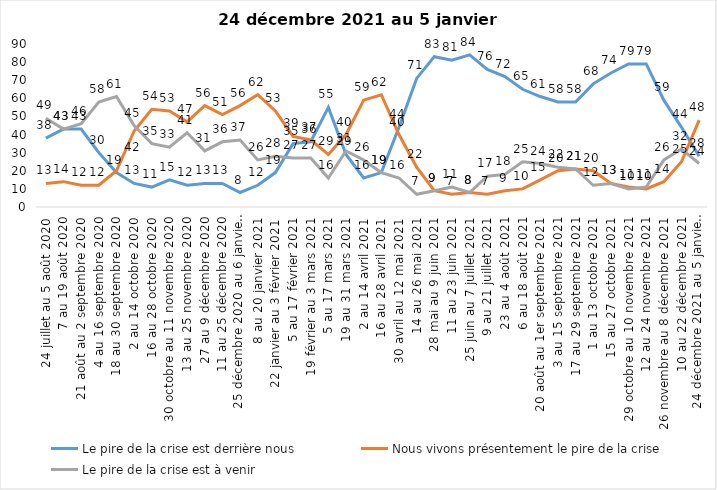
| Category | Le pire de la crise est derrière nous | Nous vivons présentement le pire de la crise | Le pire de la crise est à venir |
|---|---|---|---|
| 24 juillet au 5 août 2020 | 38 | 13 | 49 |
| 7 au 19 août 2020 | 43 | 14 | 43 |
| 21 août au 2 septembre 2020 | 43 | 12 | 46 |
| 4 au 16 septembre 2020 | 30 | 12 | 58 |
| 18 au 30 septembre 2020 | 19 | 20 | 61 |
| 2 au 14 octobre 2020 | 13 | 42 | 45 |
| 16 au 28 octobre 2020 | 11 | 54 | 35 |
| 30 octobre au 11 novembre 2020 | 15 | 53 | 33 |
| 13 au 25 novembre 2020 | 12 | 47 | 41 |
| 27 au 9 décembre 2020 | 13 | 56 | 31 |
| 11 au 25 décembre 2020 | 13 | 51 | 36 |
| 25 décembre 2020 au 6 janvier 2021 | 8 | 56 | 37 |
| 8 au 20 janvier 2021 | 12 | 62 | 26 |
| 22 janvier au 3 février 2021 | 19 | 53 | 28 |
| 5 au 17 février 2021 | 35 | 39 | 27 |
| 19 février au 3 mars 2021 | 36 | 37 | 27 |
| 5 au 17 mars 2021 | 55 | 29 | 16 |
| 19 au 31 mars 2021 | 29 | 40 | 31 |
| 2 au 14 avril 2021 | 16 | 59 | 26 |
| 16 au 28 avril 2021 | 19 | 62 | 19 |
| 30 avril au 12 mai 2021 | 44 | 40 | 16 |
| 14 au 26 mai 2021 | 71 | 22 | 7 |
| 28 mai au 9 juin 2021 | 83 | 9 | 9 |
| 11 au 23 juin 2021 | 81 | 7 | 11 |
| 25 juin au 7 juillet 2021 | 84 | 8 | 8 |
| 9 au 21 juillet 2021 | 76 | 7 | 17 |
| 23 au 4 août 2021 | 72 | 9 | 18 |
| 6 au 18 août 2021 | 65 | 10 | 25 |
| 20 août au 1er septembre 2021 | 61 | 15 | 24 |
| 3 au 15 septembre 2021 | 58 | 20 | 22 |
| 17 au 29 septembre 2021 | 58 | 21 | 21 |
| 1 au 13 octobre 2021 | 68 | 20 | 12 |
| 15 au 27 octobre 2021 | 74 | 13 | 13 |
| 29 octobre au 10 novembre 2021 | 79 | 11 | 10 |
| 12 au 24 novembre 2021 | 79 | 10 | 11 |
| 26 novembre au 8 décembre 2021 | 59 | 14 | 26 |
| 10 au 22 décembre 2021 | 44 | 25 | 32 |
| 24 décembre 2021 au 5 janvier 2022 | 28 | 48 | 24 |